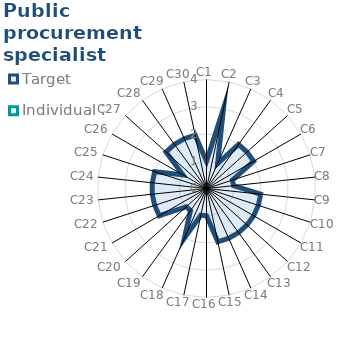
| Category | Target | Individual 2 |
|---|---|---|
| C1 | 1 | 0 |
| C2 | 3 | 0 |
| C3 | 1 | 0 |
| C4 | 2 | 0 |
| C5 | 2 | 0 |
| C6 | 2 | 0 |
| C7 | 1 | 0 |
| C8 | 1 | 0 |
| C9 | 2 | 0 |
| C10 | 2 | 0 |
| C11 | 2 | 0 |
| C12 | 2 | 0 |
| C13 | 2 | 0 |
| C14 | 2 | 0 |
| C15 | 2 | 0 |
| C16 | 1 | 0 |
| C17 | 1 | 0 |
| C18 | 2 | 0 |
| C19 | 1 | 0 |
| C20 | 1 | 0 |
| C21 | 2 | 0 |
| C22 | 2 | 0 |
| C23 | 2 | 0 |
| C24 | 2 | 0 |
| C25 | 2 | 0 |
| C26 | 1 | 0 |
| C27 | 2 | 0 |
| C28 | 2 | 0 |
| C29 | 2 | 0 |
| C30 | 2 | 0 |